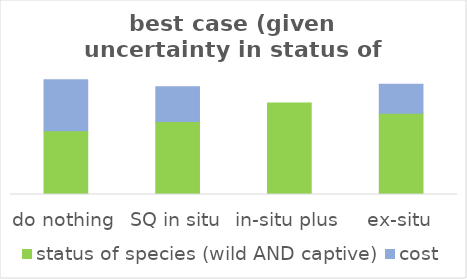
| Category | status of species (wild AND captive) | cost |
|---|---|---|
| do nothing | 0.418 | 0.333 |
| SQ in situ | 0.478 | 0.228 |
| in-situ plus | 0.6 | 0 |
| ex-situ | 0.532 | 0.191 |